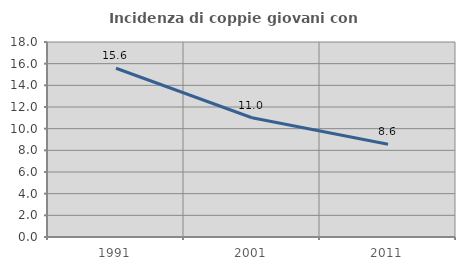
| Category | Incidenza di coppie giovani con figli |
|---|---|
| 1991.0 | 15.577 |
| 2001.0 | 11.01 |
| 2011.0 | 8.557 |